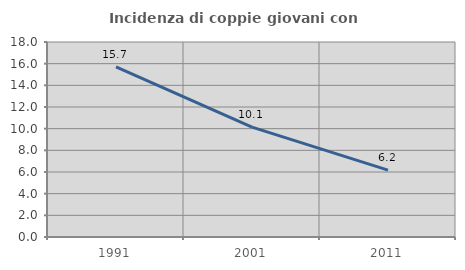
| Category | Incidenza di coppie giovani con figli |
|---|---|
| 1991.0 | 15.712 |
| 2001.0 | 10.142 |
| 2011.0 | 6.176 |